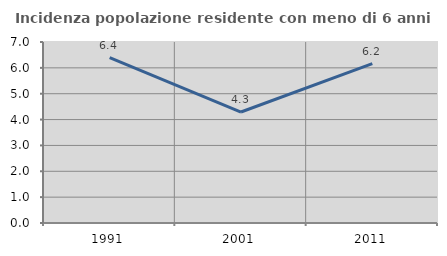
| Category | Incidenza popolazione residente con meno di 6 anni |
|---|---|
| 1991.0 | 6.396 |
| 2001.0 | 4.292 |
| 2011.0 | 6.166 |